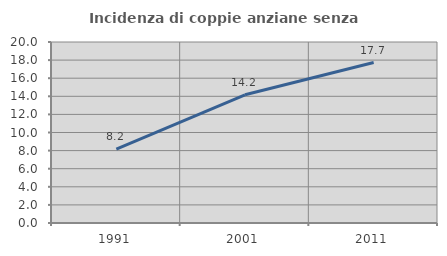
| Category | Incidenza di coppie anziane senza figli  |
|---|---|
| 1991.0 | 8.163 |
| 2001.0 | 14.167 |
| 2011.0 | 17.727 |